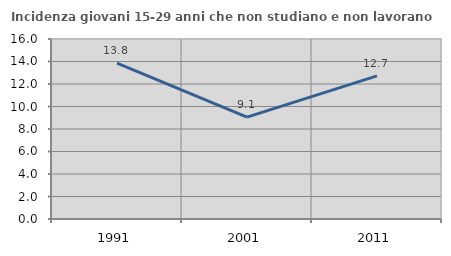
| Category | Incidenza giovani 15-29 anni che non studiano e non lavorano  |
|---|---|
| 1991.0 | 13.846 |
| 2001.0 | 9.051 |
| 2011.0 | 12.719 |